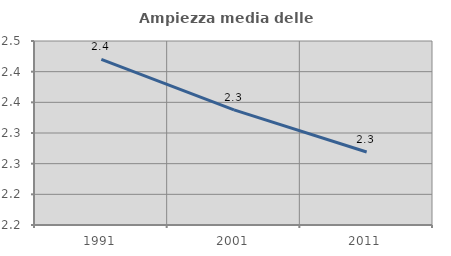
| Category | Ampiezza media delle famiglie |
|---|---|
| 1991.0 | 2.42 |
| 2001.0 | 2.338 |
| 2011.0 | 2.269 |